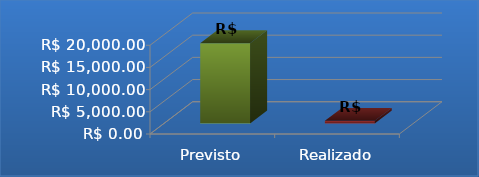
| Category | Series 0 |
|---|---|
| Previsto | 18080 |
| Realizado | 600 |